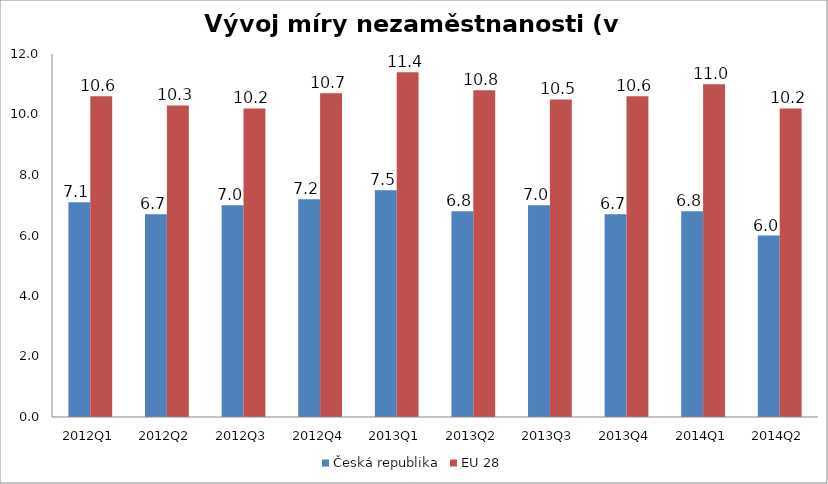
| Category | Česká republika | EU 28 |
|---|---|---|
| 2012Q1 | 7.1 | 10.6 |
| 2012Q2 | 6.7 | 10.3 |
| 2012Q3 | 7 | 10.2 |
| 2012Q4 | 7.2 | 10.7 |
| 2013Q1 | 7.5 | 11.4 |
| 2013Q2 | 6.8 | 10.8 |
| 2013Q3 | 7 | 10.5 |
| 2013Q4 | 6.7 | 10.6 |
| 2014Q1 | 6.8 | 11 |
| 2014Q2 | 6 | 10.2 |